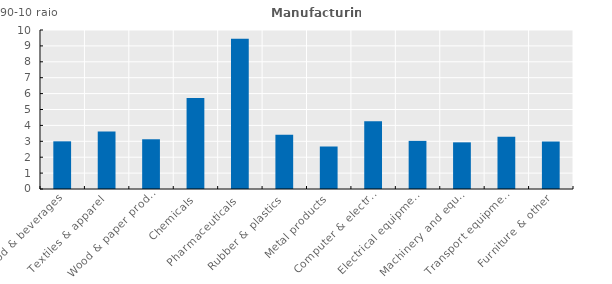
| Category | Series 0 |
|---|---|
| Food & beverages | 2.998 |
| Textiles & apparel  | 3.622 |
| Wood & paper prod.  | 3.128 |
| Chemicals | 5.726 |
| Pharmaceuticals  | 9.445 |
| Rubber & plastics  | 3.412 |
| Metal products | 2.673 |
| Computer & electronics  | 4.255 |
| Electrical equipment | 3.026 |
| Machinery and equipment | 2.934 |
| Transport equipment  | 3.289 |
| Furniture & other | 2.986 |